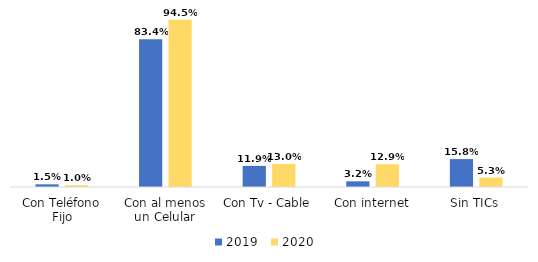
| Category | 2019 | 2020 |
|---|---|---|
| Con Teléfono Fijo | 0.015 | 0.01 |
| Con al menos un Celular | 0.834 | 0.945 |
| Con Tv - Cable | 0.119 | 0.13 |
| Con internet | 0.032 | 0.129 |
| Sin TICs | 0.158 | 0.053 |